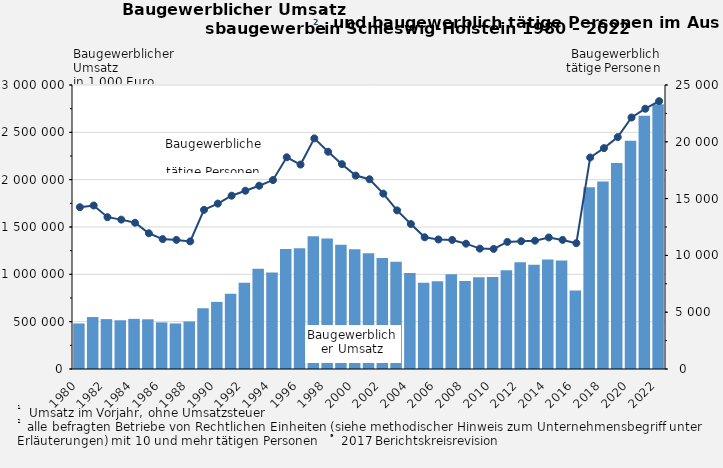
| Category | Baugewerblicher 
Umsatz in 1000 Euro |
|---|---|
| 1980.0 | 481176 |
| 1981.0 | 548606 |
| 1982.0 | 527072 |
| 1983.0 | 514714 |
| 1984.0 | 529751 |
| 1985.0 | 525282 |
| 1986.0 | 492517 |
| 1987.0 | 480997 |
| 1988.0 | 502088 |
| 1989.0 | 641996 |
| 1990.0 | 708757 |
| 1991.0 | 795322 |
| 1992.0 | 910513 |
| 1993.0 | 1057892 |
| 1994.0 | 1020468 |
| 1995.0 | 1267202 |
| 1996.0 | 1274585 |
| 1997.0 | 1402303 |
| 1998.0 | 1377951 |
| 1999.0 | 1313100 |
| 2000.0 | 1264873 |
| 2001.0 | 1222932 |
| 2002.0 | 1173826 |
| 2003.0 | 1132688 |
| 2004.0 | 1014311 |
| 2005.0 | 909914 |
| 2006.0 | 925834 |
| 2007.0 | 1001274 |
| 2008.0 | 930127 |
| 2009.0 | 969939 |
| 2010.0 | 971758 |
| 2011.0 | 1042728 |
| 2012.0 | 1128002 |
| 2013.0 | 1101137 |
| 2014.0 | 1156305 |
| 2015.0 | 1144920 |
| 2016.0 | 828538 |
| 2017.0 | 1920283 |
| 2018.0 | 1980842 |
| 2019.0 | 2175144.56 |
| 2020.0 | 2412149 |
| 2021.0 | 2675786 |
| 2022.0 | 2796731 |